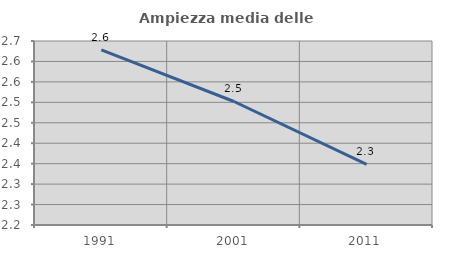
| Category | Ampiezza media delle famiglie |
|---|---|
| 1991.0 | 2.628 |
| 2001.0 | 2.502 |
| 2011.0 | 2.348 |